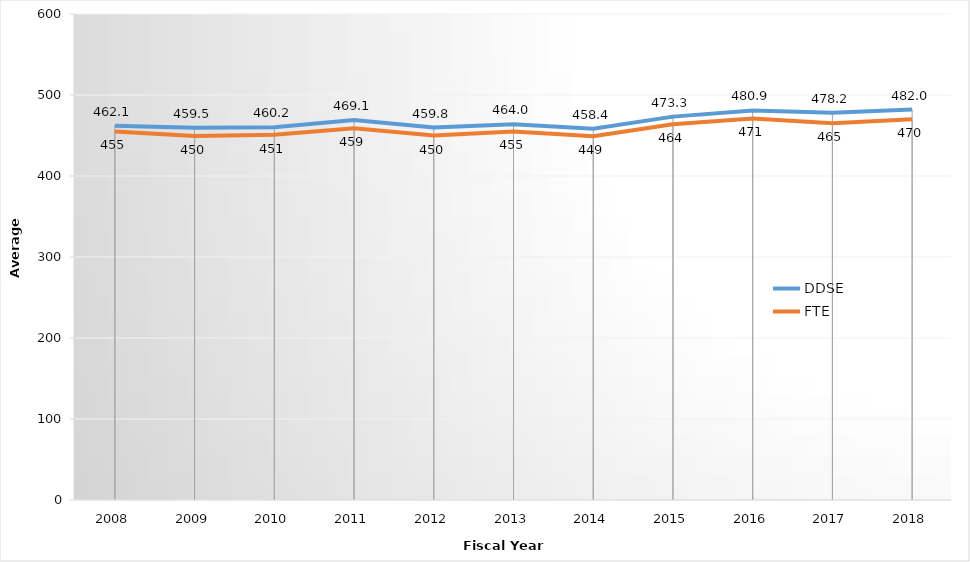
| Category | DDSE | FTE |
|---|---|---|
| 2008.0 | 462.1 | 455 |
| 2009.0 | 459.5 | 449.5 |
| 2010.0 | 460.2 | 451 |
| 2011.0 | 469.1 | 459 |
| 2012.0 | 459.8 | 450 |
| 2013.0 | 464 | 455 |
| 2014.0 | 458.4 | 449 |
| 2015.0 | 473.3 | 464 |
| 2016.0 | 480.9 | 471 |
| 2017.0 | 478.2 | 465 |
| 2018.0 | 482 | 470 |